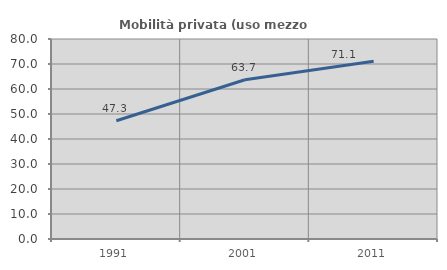
| Category | Mobilità privata (uso mezzo privato) |
|---|---|
| 1991.0 | 47.299 |
| 2001.0 | 63.705 |
| 2011.0 | 71.079 |